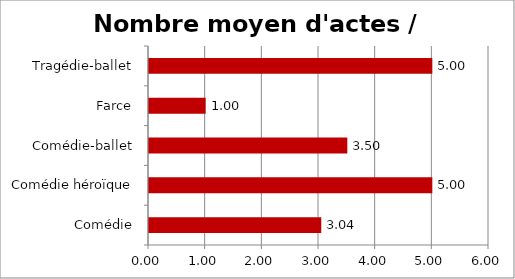
| Category | Nombre moyen d'actes / Genre |
|---|---|
| Comédie | 3.04 |
| Comédie héroïque | 5 |
| Comédie-ballet | 3.5 |
| Farce | 1 |
| Tragédie-ballet | 5 |